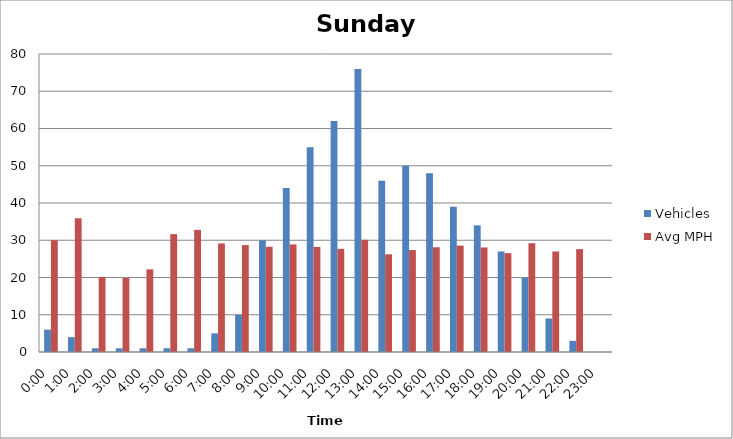
| Category | Vehicles | Avg MPH |
|---|---|---|
| 0:00 | 6 | 30.01 |
| 1:00 | 4 | 35.9 |
| 2:00 | 1 | 20.15 |
| 3:00 | 1 | 19.88 |
| 4:00 | 1 | 22.19 |
| 5:00 | 1 | 31.64 |
| 6:00 | 1 | 32.78 |
| 7:00 | 5 | 29.14 |
| 8:00 | 10 | 28.69 |
| 9:00 | 30 | 28.24 |
| 10:00 | 44 | 28.88 |
| 11:00 | 55 | 28.19 |
| 12:00 | 62 | 27.69 |
| 13:00 | 76 | 30.11 |
| 14:00 | 46 | 26.22 |
| 15:00 | 50 | 27.37 |
| 16:00 | 48 | 28.11 |
| 17:00 | 39 | 28.56 |
| 18:00 | 34 | 28.06 |
| 19:00 | 27 | 26.54 |
| 20:00 | 20 | 29.2 |
| 21:00 | 9 | 26.99 |
| 22:00 | 3 | 27.61 |
| 23:00 | 0 | 0 |